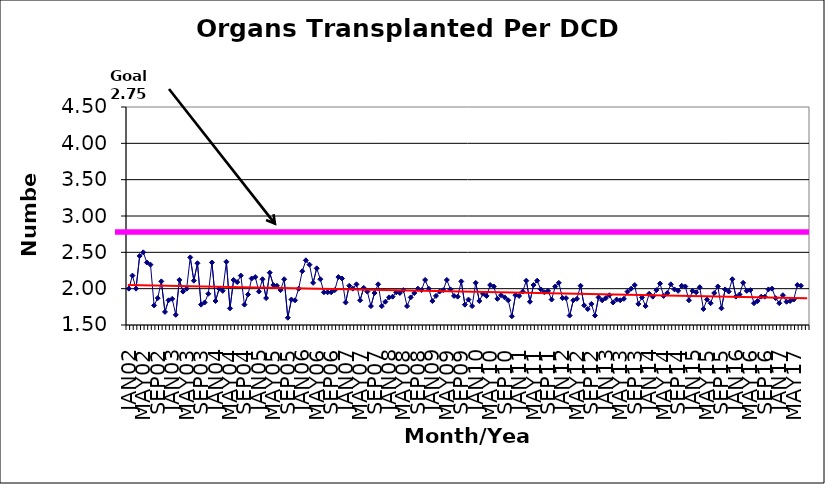
| Category | Series 0 |
|---|---|
| JAN02 | 2 |
| FEB02 | 2.18 |
| MAR02 | 2 |
| APR02 | 2.45 |
| MAY02 | 2.5 |
| JUN02 | 2.36 |
| JUL02 | 2.33 |
| AUG02 | 1.77 |
| SEP02 | 1.87 |
| OCT02 | 2.1 |
| NOV02 | 1.68 |
| DEC02 | 1.84 |
| JAN03 | 1.86 |
| FEB03 | 1.64 |
| MAR03 | 2.12 |
| APR03 | 1.96 |
| MAY03 | 2 |
| JUN03 | 2.43 |
| JUL03 | 2.11 |
| AUG03 | 2.35 |
| SEP03 | 1.78 |
| OCT03 | 1.81 |
| NOV03 | 1.93 |
| DEC03 | 2.36 |
| JAN04 | 1.83 |
| FEB04 | 2 |
| MAR04 | 1.97 |
| APR04 | 2.37 |
| MAY04 | 1.73 |
| JUN04 | 2.12 |
| JUL04 | 2.09 |
| AUG04 | 2.18 |
| SEP04 | 1.78 |
| OCT04 | 1.92 |
| NOV04 | 2.14 |
| DEC04 | 2.16 |
| JAN05 | 1.96 |
| FEB05 | 2.13 |
| MAR05 | 1.87 |
| APR05 | 2.22 |
| MAY05 | 2.05 |
| JUN05 | 2.04 |
| JUL05 | 1.98 |
| AUG05 | 2.13 |
| SEP05 | 1.6 |
| OCT05 | 1.85 |
| NOV05 | 1.84 |
| DEC05 | 2 |
| JAN06 | 2.24 |
| FEB06 | 2.39 |
| MAR06 | 2.33 |
| APR06 | 2.08 |
| MAY06 | 2.28 |
| JUN06 | 2.13 |
| JUL06 | 1.95 |
| AUG06 | 1.95 |
| SEP06 | 1.95 |
| OCT06 | 1.98 |
| NOV06 | 2.16 |
| DEC06 | 2.14 |
| JAN07 | 1.81 |
| FEB07 | 2.04 |
| MAR07 | 2 |
| APR07 | 2.06 |
| MAY07 | 1.84 |
| JUN07 | 2.01 |
| JUL07 | 1.96 |
| AUG07 | 1.76 |
| SEP07 | 1.94 |
| OCT07 | 2.06 |
| NOV07 | 1.76 |
| DEC07 | 1.82 |
| JAN08 | 1.88 |
| FEB08 | 1.89 |
| MAR08 | 1.95 |
| APR08 | 1.94 |
| MAY08 | 1.98 |
| JUN08 | 1.76 |
| JUL08 | 1.88 |
| AUG08 | 1.94 |
| SEP08 | 2 |
| OCT08 | 1.98 |
| NOV08 | 2.12 |
| DEC08 | 2 |
| JAN09 | 1.83 |
| FEB09 | 1.9 |
| MAR09 | 1.96 |
| APR09 | 1.98 |
| MAY09 | 2.12 |
| JUN09 | 1.99 |
| JUL09 | 1.9 |
| AUG09 | 1.89 |
| SEP09 | 2.1 |
| OCT09 | 1.78 |
| NOV09 | 1.85 |
| DEC09 | 1.76 |
| JAN10 | 2.08 |
| FEB10 | 1.83 |
| MAR10 | 1.93 |
| APR10 | 1.9 |
| MAY10 | 2.05 |
| JUN10 | 2.03 |
| JUL10 | 1.86 |
| AUG10 | 1.91 |
| SEP10 | 1.88 |
| OCT10 | 1.84 |
| NOV10 | 1.62 |
| DEC10 | 1.91 |
| JAN11 | 1.9 |
| FEB11 | 1.96 |
| MAR11 | 2.11 |
| APR11 | 1.82 |
| MAY11 | 2.05 |
| JUN11 | 2.11 |
| JUL11 | 1.99 |
| AUG11 | 1.95 |
| SEP11 | 1.97 |
| OCT11 | 1.85 |
| NOV11 | 2.03 |
| DEC11 | 2.08 |
| JAN12 | 1.87 |
| FEB12 | 1.87 |
| MAR12 | 1.63 |
| APR12 | 1.84 |
| MAY12 | 1.86 |
| JUN12 | 2.04 |
| JUL12 | 1.77 |
| AUG12 | 1.72 |
| SEP12 | 1.79 |
| OCT12 | 1.63 |
| NOV12 | 1.88 |
| DEC12 | 1.84 |
| JAN13 | 1.87 |
| FEB13 | 1.91 |
| MAR13 | 1.81 |
| APR13 | 1.85 |
| MAY13 | 1.84 |
| JUN13 | 1.86 |
| JUL13 | 1.96 |
| AUG13 | 2 |
| SEP13 | 2.05 |
| OCT13 | 1.79 |
| NOV13 | 1.88 |
| DEC13 | 1.76 |
| JAN14 | 1.93 |
| FEB14 | 1.89 |
| MAR14 | 1.98 |
| APR14 | 2.07 |
| MAY14 | 1.9 |
| JUN14 | 1.94 |
| JUL14 | 2.06 |
| AUG14 | 1.99 |
| SEP14 | 1.97 |
| OCT14 | 2.04 |
| NOV14 | 2.03 |
| DEC14 | 1.84 |
| JAN15 | 1.97 |
| FEB15 | 1.95 |
| MAR15 | 2.02 |
| APR15 | 1.72 |
| MAY15 | 1.85 |
| JUN15 | 1.8 |
| JUL15 | 1.94 |
| AUG15 | 2.03 |
| SEP15 | 1.73 |
| OCT15 | 1.99 |
| NOV15 | 1.96 |
| DEC15 | 2.13 |
| JAN16 | 1.89 |
| FEB16 | 1.92 |
| MAR16 | 2.08 |
| APR16 | 1.97 |
| MAY16 | 1.98 |
| JUN16 | 1.8 |
| JUL16 | 1.83 |
| AUG16 | 1.89 |
| SEP16 | 1.89 |
| OCT16 | 1.99 |
| NOV16 | 2 |
| DEC16 | 1.87 |
| JAN17 | 1.8 |
| FEB17 | 1.91 |
| MAR17 | 1.82 |
| APR17 | 1.83 |
| MAY17 | 1.85 |
| JUN17 | 2.05 |
| JUL17 | 2.04 |